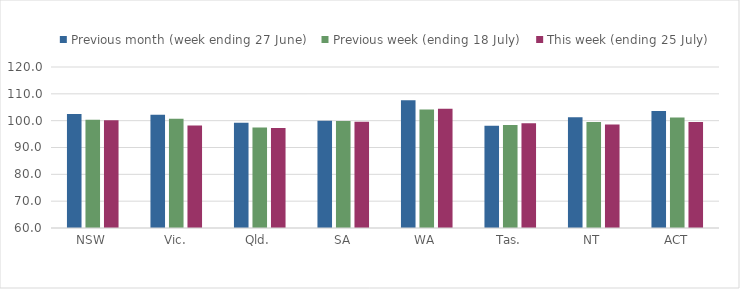
| Category | Previous month (week ending 27 June) | Previous week (ending 18 July) | This week (ending 25 July) |
|---|---|---|---|
| NSW | 102.477 | 100.342 | 100.114 |
| Vic. | 102.221 | 100.717 | 98.166 |
| Qld. | 99.204 | 97.428 | 97.257 |
| SA | 99.938 | 99.921 | 99.558 |
| WA | 107.608 | 104.191 | 104.466 |
| Tas. | 98.111 | 98.405 | 98.996 |
| NT | 101.247 | 99.46 | 98.598 |
| ACT | 103.57 | 101.136 | 99.481 |